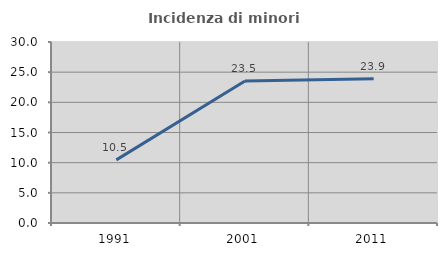
| Category | Incidenza di minori stranieri |
|---|---|
| 1991.0 | 10.465 |
| 2001.0 | 23.534 |
| 2011.0 | 23.927 |